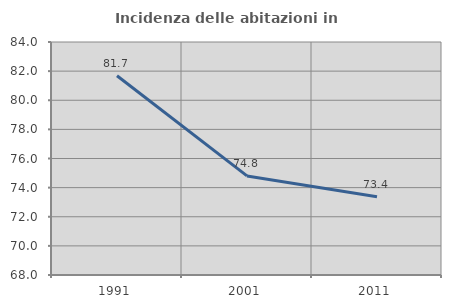
| Category | Incidenza delle abitazioni in proprietà  |
|---|---|
| 1991.0 | 81.686 |
| 2001.0 | 74.803 |
| 2011.0 | 73.368 |